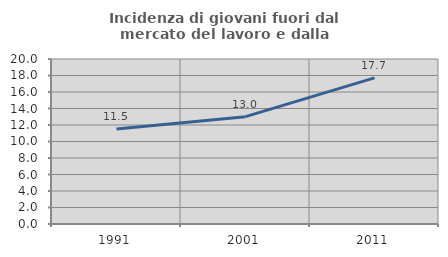
| Category | Incidenza di giovani fuori dal mercato del lavoro e dalla formazione  |
|---|---|
| 1991.0 | 11.518 |
| 2001.0 | 13.008 |
| 2011.0 | 17.708 |